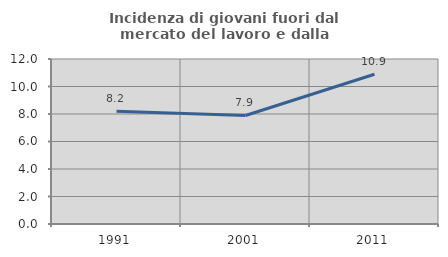
| Category | Incidenza di giovani fuori dal mercato del lavoro e dalla formazione  |
|---|---|
| 1991.0 | 8.205 |
| 2001.0 | 7.895 |
| 2011.0 | 10.887 |